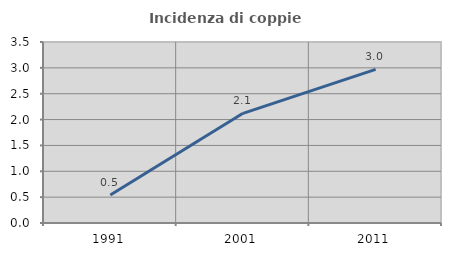
| Category | Incidenza di coppie miste |
|---|---|
| 1991.0 | 0.542 |
| 2001.0 | 2.121 |
| 2011.0 | 2.97 |